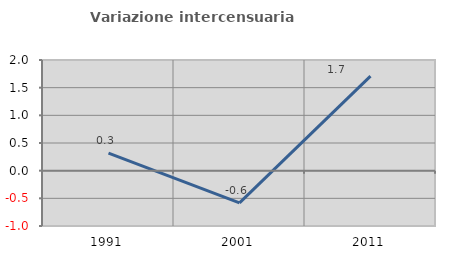
| Category | Variazione intercensuaria annua |
|---|---|
| 1991.0 | 0.316 |
| 2001.0 | -0.581 |
| 2011.0 | 1.707 |